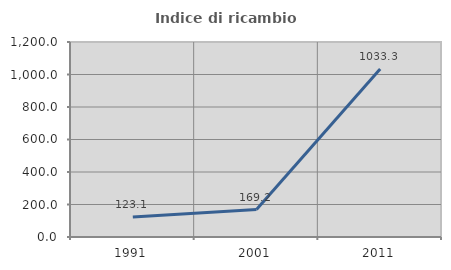
| Category | Indice di ricambio occupazionale  |
|---|---|
| 1991.0 | 123.077 |
| 2001.0 | 169.231 |
| 2011.0 | 1033.333 |